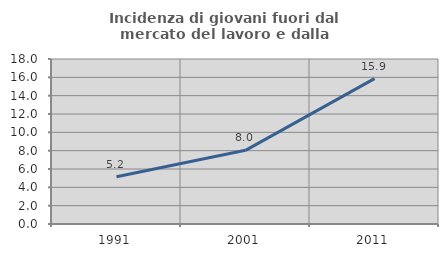
| Category | Incidenza di giovani fuori dal mercato del lavoro e dalla formazione  |
|---|---|
| 1991.0 | 5.155 |
| 2001.0 | 8.036 |
| 2011.0 | 15.854 |